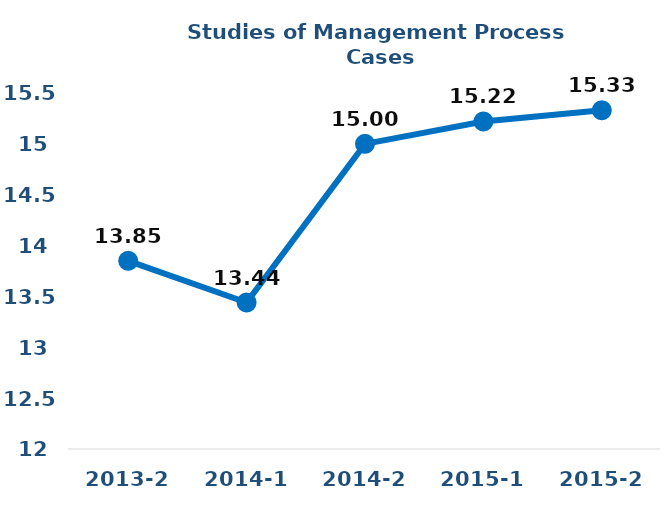
| Category | Series 0 |
|---|---|
| 2013-2 | 13.85 |
| 2014-1 | 13.44 |
| 2014-2 | 15 |
| 2015-1 | 15.22 |
| 2015-2 | 15.33 |